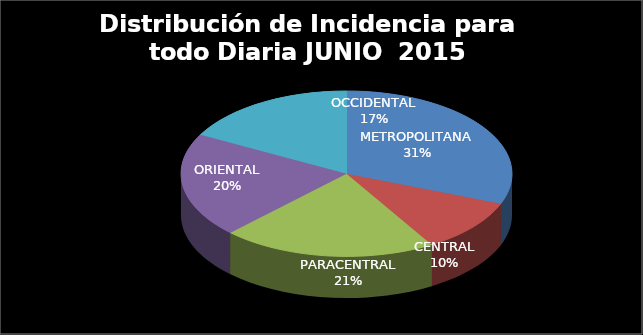
| Category | Series 0 |
|---|---|
| METROPOLITANA | 0.309 |
| CENTRAL | 0.105 |
| PARACENTRAL | 0.21 |
| ORIENTAL | 0.204 |
| OCCIDENTAL | 0.172 |